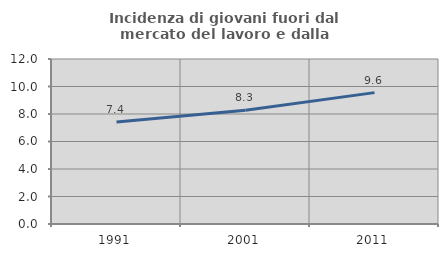
| Category | Incidenza di giovani fuori dal mercato del lavoro e dalla formazione  |
|---|---|
| 1991.0 | 7.419 |
| 2001.0 | 8.269 |
| 2011.0 | 9.554 |